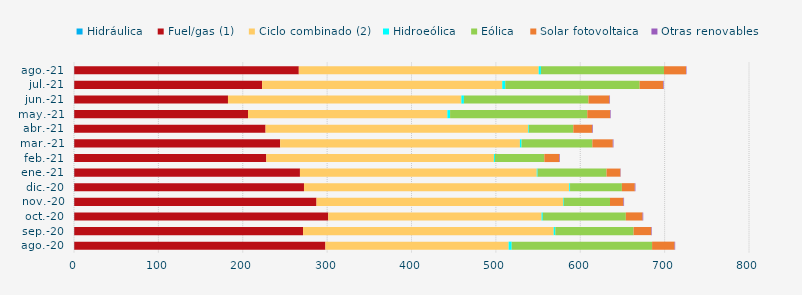
| Category | Hidráulica | Fuel/gas (1) | Ciclo combinado (2) | Hidroeólica | Eólica | Solar fotovoltaica | Otras renovables |
|---|---|---|---|---|---|---|---|
| ago.-20 | 0.294 | 297.661 | 217.205 | 3.576 | 166.404 | 26.667 | 0.691 |
| sep.-20 | 0.292 | 271.163 | 297.078 | 1.912 | 92.772 | 20.952 | 0.65 |
| oct.-20 | 0.299 | 301.034 | 252.831 | 1.457 | 98.401 | 19.852 | 0.783 |
| nov.-20 | 0.285 | 287.125 | 292.221 | 0.822 | 54.805 | 15.933 | 0.743 |
| dic.-20 | 0.3 | 272.275 | 314.373 | 0.959 | 61.442 | 15.285 | 0.753 |
| ene.-21 | 0.298 | 267.491 | 280.66 | 0.993 | 81.696 | 16.465 | 0.359 |
| feb.-21 | 0.259 | 227.675 | 269.761 | 1.226 | 58.505 | 17.767 | 0.7 |
| mar.-21 | 0.282 | 244.022 | 284.196 | 1.921 | 83.922 | 24.228 | 0.792 |
| abr.-21 | 0.138 | 226.895 | 311.21 | 0.836 | 52.701 | 22.565 | 0.722 |
| may.-21 | 0.268 | 205.958 | 236.283 | 3.227 | 162.603 | 27.019 | 0.723 |
| jun.-21 | 0.282 | 182.213 | 276.616 | 3.002 | 147.643 | 24.792 | 0.724 |
| jul.-21 | 0.29 | 222.639 | 284.61 | 3.578 | 159.263 | 27.918 | 0.734 |
| ago.-21 | 0.281 | 266.149 | 284.301 | 2.663 | 145.857 | 26.101 | 0.57 |